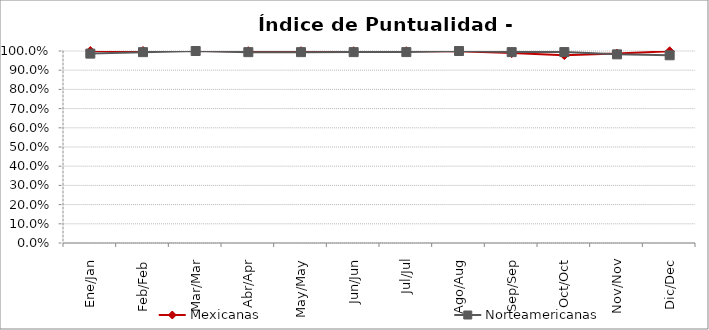
| Category | Mexicanas | Norteamericanas |
|---|---|---|
| Ene/Jan | 1 | 0.986 |
| Feb/Feb | 1 | 0.994 |
| Mar/Mar | 1 | 1 |
| Abr/Apr | 0.999 | 0.994 |
| May/May | 0.999 | 0.994 |
| Jun/Jun | 0.999 | 0.994 |
| Jul/Jul | 0.999 | 0.994 |
| Ago/Aug | 0.999 | 1 |
| Sep/Sep | 0.989 | 0.994 |
| Oct/Oct | 0.978 | 0.994 |
| Nov/Nov | 0.987 | 0.983 |
| Dic/Dec | 0.998 | 0.978 |